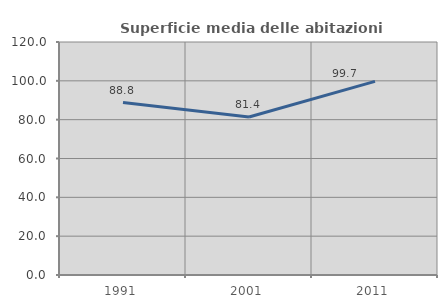
| Category | Superficie media delle abitazioni occupate |
|---|---|
| 1991.0 | 88.808 |
| 2001.0 | 81.359 |
| 2011.0 | 99.695 |